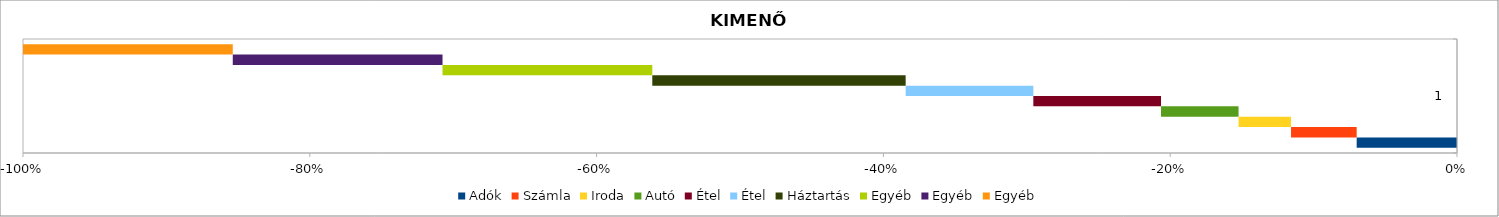
| Category | Adók | Számla | Iroda | Autó | Étel | Háztartás | Egyéb |
|---|---|---|---|---|---|---|---|
| 0 | -220 | -143.94 | -115.1 | -170.04 | -280 | -555.6 | -460 |